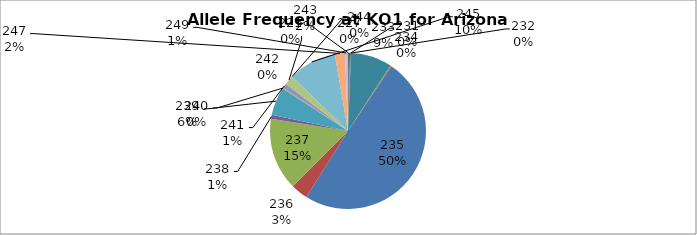
| Category | Series 0 |
|---|---|
| 221.0 | 0.002 |
| 227.0 | 0.002 |
| 231.0 | 0.002 |
| 232.0 | 0 |
| 233.0 | 0.085 |
| 234.0 | 0.002 |
| 235.0 | 0.496 |
| 236.0 | 0.035 |
| 237.0 | 0.15 |
| 238.0 | 0.008 |
| 239.0 | 0.058 |
| 240.0 | 0.002 |
| 241.0 | 0.008 |
| 242.0 | 0.002 |
| 243.0 | 0.019 |
| 244.0 | 0 |
| 245.0 | 0.1 |
| 247.0 | 0.021 |
| 249.0 | 0.006 |